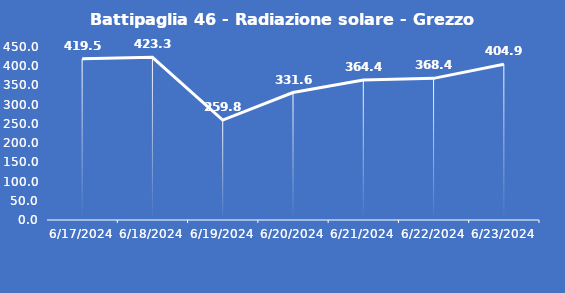
| Category | Battipaglia 46 - Radiazione solare - Grezzo (W/m2) |
|---|---|
| 6/17/24 | 419.5 |
| 6/18/24 | 423.3 |
| 6/19/24 | 259.8 |
| 6/20/24 | 331.6 |
| 6/21/24 | 364.4 |
| 6/22/24 | 368.4 |
| 6/23/24 | 404.9 |